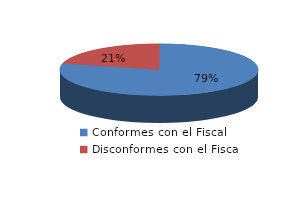
| Category | Series 0 |
|---|---|
| 0 | 2635 |
| 1 | 705 |